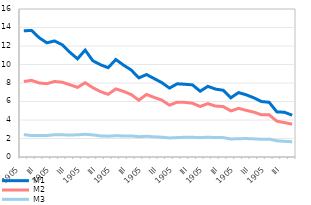
| Category | M1 | M2 | M3 |
|---|---|---|---|
| 2012 | 13.639 | 8.164 | 2.423 |
| II | 13.689 | 8.283 | 2.318 |
| III | 12.893 | 8.004 | 2.327 |
| IV | 12.342 | 7.926 | 2.321 |
| 2013 | 12.547 | 8.164 | 2.409 |
| II | 12.14 | 8.086 | 2.399 |
| III | 11.324 | 7.815 | 2.38 |
| IV | 10.614 | 7.526 | 2.4 |
| 2014 | 11.557 | 8.031 | 2.452 |
| II | 10.403 | 7.493 | 2.391 |
| III | 9.972 | 7.067 | 2.282 |
| IV | 9.656 | 6.777 | 2.251 |
| 2015 | 10.539 | 7.363 | 2.3 |
| II | 9.933 | 7.097 | 2.275 |
| III | 9.408 | 6.752 | 2.281 |
| IV | 8.554 | 6.143 | 2.191 |
| 2016 | 8.914 | 6.764 | 2.241 |
| II | 8.476 | 6.441 | 2.181 |
| III | 8.039 | 6.151 | 2.143 |
| IV | 7.449 | 5.602 | 2.061 |
| 2017 | 7.914 | 5.927 | 2.098 |
| II | 7.864 | 5.906 | 2.134 |
| III | 7.796 | 5.812 | 2.131 |
| IV | 7.109 | 5.459 | 2.092 |
| 2018 | 7.639 | 5.765 | 2.144 |
| II | 7.345 | 5.506 | 2.096 |
| III | 7.214 | 5.455 | 2.097 |
| IV | 6.403 | 4.984 | 1.947 |
| 2019 | 6.962 | 5.26 | 1.981 |
| II | 6.724 | 5.045 | 1.993 |
| III | 6.399 | 4.846 | 1.962 |
| IV | 5.996 | 4.566 | 1.919 |
| 2020 | 5.913 | 4.555 | 1.934 |
| II | 4.878 | 3.878 | 1.753 |
| III | 4.836 | 3.717 | 1.696 |
| IV | 4.517 | 3.547 | 1.653 |